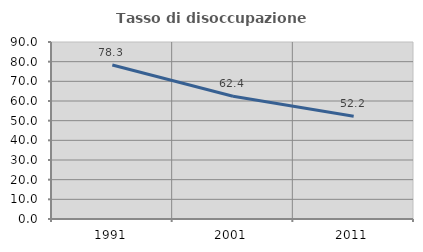
| Category | Tasso di disoccupazione giovanile  |
|---|---|
| 1991.0 | 78.332 |
| 2001.0 | 62.44 |
| 2011.0 | 52.23 |